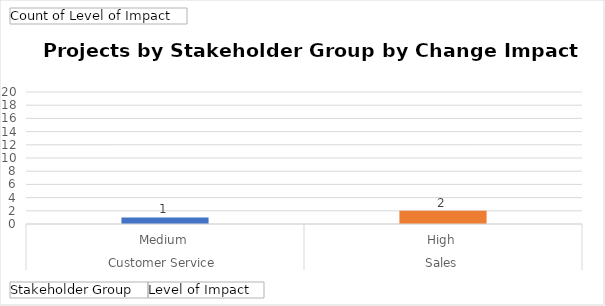
| Category | Total |
|---|---|
| 0 | 1 |
| 1 | 2 |